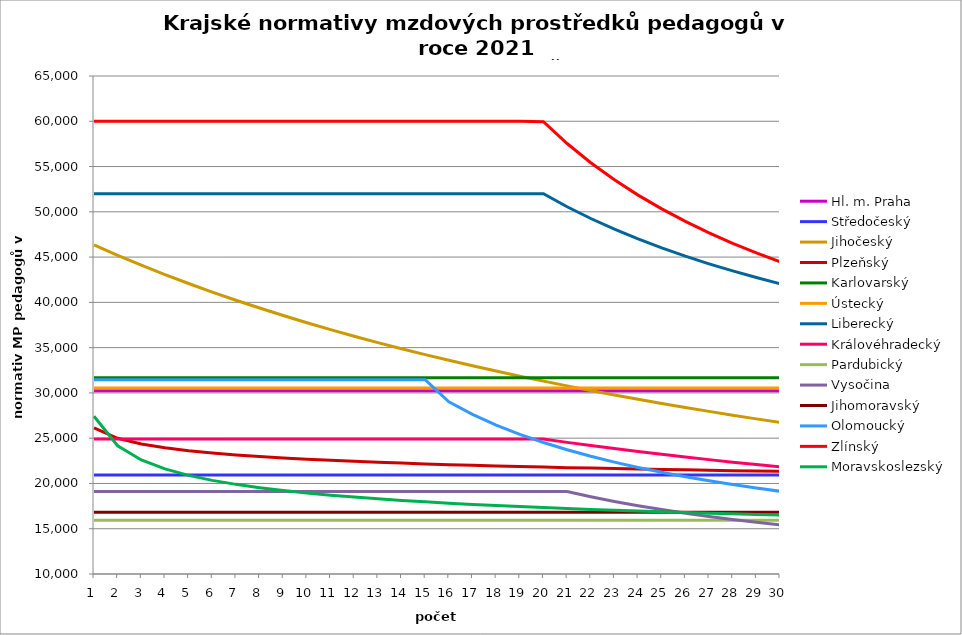
| Category | Hl. m. Praha | Středočeský | Jihočeský | Plzeňský | Karlovarský  | Ústecký   | Liberecký | Královéhradecký | Pardubický | Vysočina | Jihomoravský | Olomoucký | Zlínský | Moravskoslezský |
|---|---|---|---|---|---|---|---|---|---|---|---|---|---|---|
| 0 | 30242.815 | 20944.32 | 46341.71 | 26125.914 | 31680 | 30538.495 | 52000.645 | 24903.579 | 15925.45 | 19116.565 | 16823.804 | 31465.459 | 60000 | 27415.384 |
| 1 | 30242.815 | 20944.32 | 45198.867 | 24987.126 | 31680 | 30538.495 | 52000.645 | 24903.579 | 15925.45 | 19116.565 | 16823.804 | 31465.459 | 60000 | 24164.678 |
| 2 | 30242.815 | 20944.32 | 44111.035 | 24357.51 | 31680 | 30538.495 | 52000.645 | 24903.579 | 15925.45 | 19116.565 | 16823.804 | 31465.459 | 60000 | 22597.319 |
| 3 | 30242.815 | 20944.32 | 43074.335 | 23931.845 | 31680 | 30538.495 | 52000.645 | 24903.579 | 15925.45 | 19116.565 | 16823.804 | 31465.459 | 60000 | 21603.142 |
| 4 | 30242.815 | 20944.32 | 42085.246 | 23610.92 | 31680 | 30538.495 | 52000.645 | 24903.579 | 15925.45 | 19116.565 | 16823.804 | 31465.459 | 60000 | 20890.253 |
| 5 | 30242.815 | 20944.32 | 41140.561 | 23364.739 | 31680 | 30538.495 | 52000.645 | 24903.579 | 15925.45 | 19116.565 | 16823.804 | 31465.459 | 60000 | 20341.789 |
| 6 | 30242.815 | 20944.32 | 40237.355 | 23145.352 | 31680 | 30538.495 | 52000.645 | 24903.579 | 15925.45 | 19116.565 | 16823.804 | 31465.459 | 60000 | 19900.05 |
| 7 | 30242.815 | 20944.32 | 39372.956 | 22972.787 | 31680 | 30538.495 | 52000.645 | 24903.579 | 15925.45 | 19116.565 | 16823.804 | 31465.459 | 60000 | 19532.62 |
| 8 | 30242.815 | 20944.32 | 38544.914 | 22813.327 | 31680 | 30538.495 | 52000.645 | 24903.579 | 15925.45 | 19116.565 | 16823.804 | 31465.459 | 60000 | 19219.605 |
| 9 | 30242.815 | 20944.32 | 37750.984 | 22676.909 | 31680 | 30538.495 | 52000.645 | 24903.579 | 15925.45 | 19116.565 | 16823.804 | 31465.459 | 60000 | 18947.985 |
| 10 | 30242.815 | 20944.32 | 36989.099 | 22552.425 | 31680 | 30538.495 | 52000.645 | 24903.579 | 15925.45 | 19116.565 | 16823.804 | 31465.459 | 60000 | 18708.805 |
| 11 | 30242.815 | 20944.32 | 36257.359 | 22439.508 | 31680 | 30538.495 | 52000.645 | 24903.579 | 15925.45 | 19116.565 | 16823.804 | 31465.459 | 60000 | 18495.663 |
| 12 | 30242.815 | 20944.32 | 35554.008 | 22337.834 | 31680 | 30538.495 | 52000.645 | 24903.579 | 15925.45 | 19116.565 | 16823.804 | 31465.459 | 60000 | 18303.835 |
| 13 | 30242.815 | 20944.32 | 34877.427 | 22247.112 | 31680 | 30538.495 | 52000.645 | 24903.579 | 15925.45 | 19116.565 | 16823.804 | 31465.459 | 60000 | 18129.745 |
| 14 | 30242.815 | 20944.32 | 34226.115 | 22157.124 | 31680 | 30538.495 | 52000.645 | 24903.579 | 15925.45 | 19116.565 | 16823.804 | 31465.459 | 60000 | 17970.621 |
| 15 | 30242.815 | 20944.32 | 33598.683 | 22077.743 | 31680 | 30538.495 | 52000.645 | 24903.579 | 15925.45 | 19116.565 | 16823.804 | 29024.821 | 60000 | 17824.278 |
| 16 | 30242.815 | 20944.32 | 32993.84 | 22008.75 | 31680 | 30538.495 | 52000.645 | 24903.579 | 15925.45 | 19116.565 | 16823.804 | 27639.545 | 60000 | 17688.965 |
| 17 | 30242.815 | 20944.32 | 32410.389 | 21940.187 | 31680 | 30538.495 | 52000.645 | 24903.579 | 15925.45 | 19116.565 | 16823.804 | 26452.202 | 60000 | 17563.256 |
| 18 | 30242.815 | 20944.32 | 31847.215 | 21872.05 | 31680 | 30538.495 | 52000.645 | 24903.579 | 15925.45 | 19116.565 | 16823.804 | 25428.96 | 60000 | 17445.98 |
| 19 | 30242.815 | 20944.32 | 31303.279 | 21804.334 | 31680 | 30538.495 | 52000.645 | 24903.579 | 15925.45 | 19116.565 | 16823.804 | 24518.952 | 59952.821 | 17336.158 |
| 20 | 30242.815 | 20944.32 | 30777.61 | 21746.625 | 31680 | 30538.495 | 50562.156 | 24537.708 | 15925.45 | 19116.565 | 16823.804 | 23717.991 | 57544.722 | 17232.972 |
| 21 | 30242.815 | 20944.32 | 30269.305 | 21698.768 | 31680 | 30538.495 | 49262.811 | 24182.432 | 15925.45 | 18537.617 | 16823.804 | 23000.284 | 55422.183 | 17135.724 |
| 22 | 30242.815 | 20944.32 | 29777.517 | 21641.615 | 31680 | 30538.495 | 48082.133 | 23848.644 | 15925.45 | 18016.543 | 16823.804 | 22355.515 | 53535.322 | 17043.82 |
| 23 | 30242.815 | 20944.32 | 29301.454 | 21594.218 | 31680 | 30538.495 | 47003.554 | 23523.944 | 15925.45 | 17544.126 | 16823.804 | 21765.369 | 51845.368 | 16956.747 |
| 24 | 30242.815 | 20944.32 | 28840.373 | 21547.028 | 31680 | 30538.495 | 46013.519 | 23218.721 | 15925.45 | 17113.878 | 16823.804 | 21233.348 | 50321.714 | 16874.061 |
| 25 | 30242.815 | 20944.32 | 28393.578 | 21500.044 | 31680 | 30538.495 | 45100.825 | 22910.837 | 15925.45 | 16719.213 | 16823.804 | 20744.392 | 48939.865 | 16795.374 |
| 26 | 30242.815 | 20944.32 | 27960.416 | 21453.264 | 31680 | 30538.495 | 44256.123 | 22631.436 | 15925.45 | 16356.685 | 16823.804 | 20294.368 | 47679.979 | 16720.347 |
| 27 | 30242.815 | 20944.32 | 27540.271 | 21415.986 | 31680 | 30538.495 | 43471.55 | 22348.796 | 15925.45 | 16022.291 | 16823.804 | 19879.689 | 46525.803 | 16648.68 |
| 28 | 30242.815 | 20944.32 | 27132.566 | 21369.571 | 31680 | 30538.495 | 42740.438 | 22082.856 | 15925.45 | 15711.591 | 16823.804 | 19497.234 | 45463.895 | 16580.109 |
| 29 | 30242.815 | 20944.32 | 26736.756 | 21332.583 | 31680 | 30538.495 | 42057.097 | 21823.171 | 15925.45 | 15423.106 | 16823.804 | 19136.743 | 44483.034 | 16514.397 |